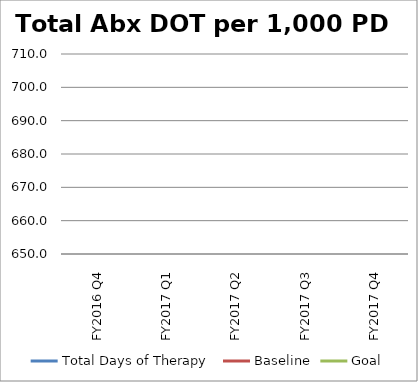
| Category | Total Days of Therapy  | Baseline | Goal |
|---|---|---|---|
| FY2016 Q4 | 0 |  |  |
| FY2017 Q1 | 0 |  |  |
| FY2017 Q2 | 0 |  |  |
| FY2017 Q3 | 0 |  |  |
| FY2017 Q4 | 0 |  |  |